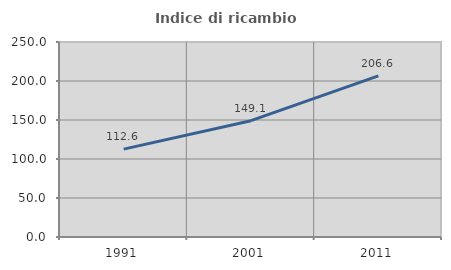
| Category | Indice di ricambio occupazionale  |
|---|---|
| 1991.0 | 112.632 |
| 2001.0 | 149.149 |
| 2011.0 | 206.55 |